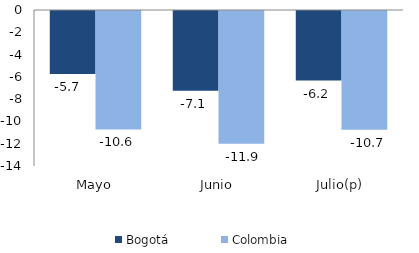
| Category | Bogotá | Colombia |
|---|---|---|
| Mayo | -5.655 | -10.632 |
| Junio | -7.149 | -11.923 |
| Julio(p) | -6.243 | -10.654 |